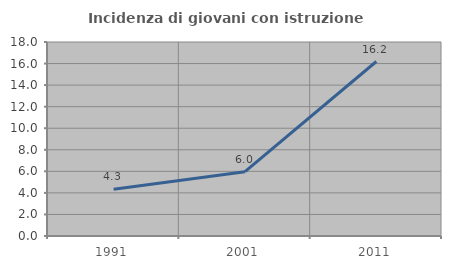
| Category | Incidenza di giovani con istruzione universitaria |
|---|---|
| 1991.0 | 4.348 |
| 2001.0 | 5.97 |
| 2011.0 | 16.19 |